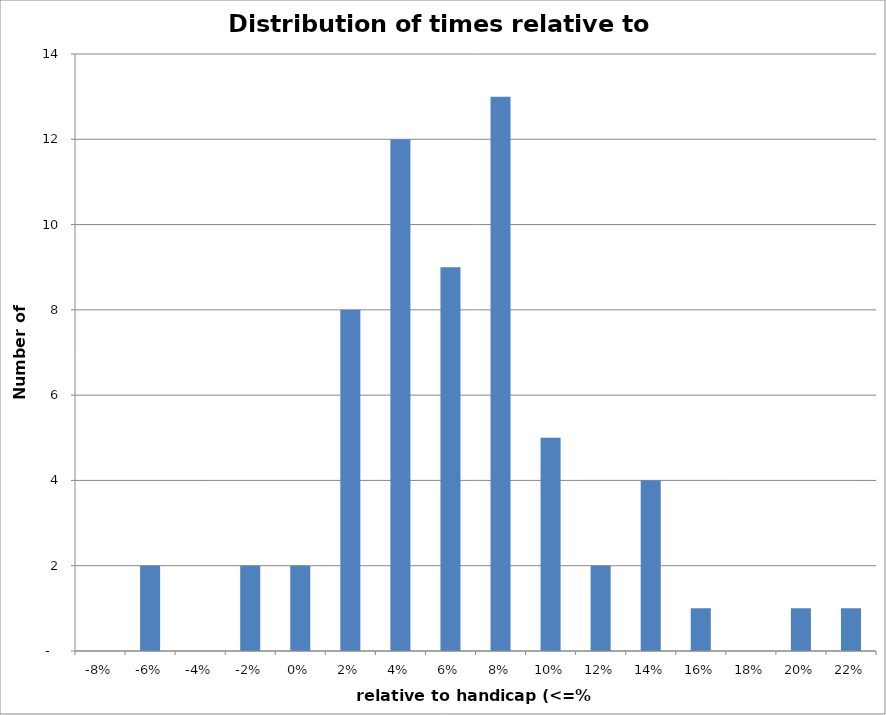
| Category | Series 0 |
|---|---|
| -0.08 | 0 |
| -0.06 | 2 |
| -0.04 | 0 |
| -0.02 | 2 |
| 0.0 | 2 |
| 0.02 | 8 |
| 0.04 | 12 |
| 0.06 | 9 |
| 0.08 | 13 |
| 0.1 | 5 |
| 0.12 | 2 |
| 0.14 | 4 |
| 0.16 | 1 |
| 0.18 | 0 |
| 0.2 | 1 |
| 0.22 | 1 |